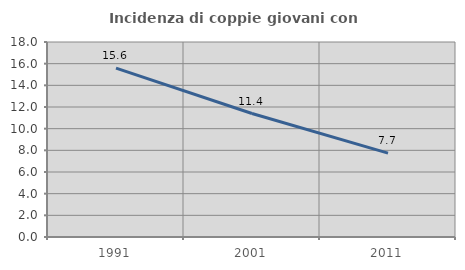
| Category | Incidenza di coppie giovani con figli |
|---|---|
| 1991.0 | 15.584 |
| 2001.0 | 11.399 |
| 2011.0 | 7.746 |